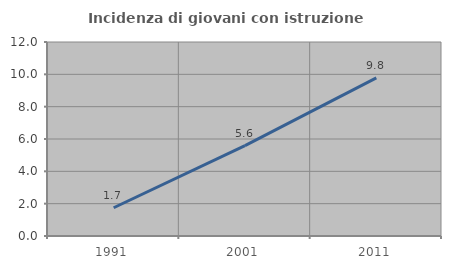
| Category | Incidenza di giovani con istruzione universitaria |
|---|---|
| 1991.0 | 1.748 |
| 2001.0 | 5.59 |
| 2011.0 | 9.783 |